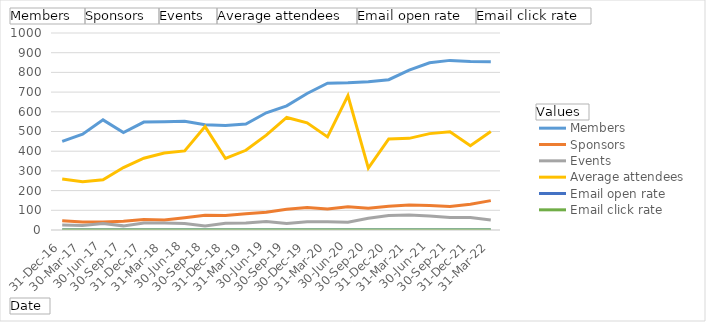
| Category | Members  | Sponsors  | Events  | Average attendees  | Email open rate  | Email click rate  |
|---|---|---|---|---|---|---|
| 31-Dec-16 | 450 | 47 | 25 | 258.817 | 0.225 | 0.022 |
| 30-Mar-17 | 486 | 40 | 23 | 244.667 | 0.233 | 0.023 |
| 30-Jun-17 | 559 | 40 | 33 | 254.867 | 0.201 | 0.014 |
| 30-Sep-17 | 495 | 44 | 21 | 317 | 0.222 | 0.02 |
| 31-Dec-17 | 548 | 53 | 36 | 364.333 | 0.22 | 0.023 |
| 31-Mar-18 | 550 | 51 | 36 | 390.667 | 0.225 | 0.027 |
| 30-Jun-18 | 552 | 62 | 33 | 401.333 | 0.216 | 0.018 |
| 30-Sep-18 | 534 | 75 | 20 | 525 | 0.208 | 0.026 |
| 31-Dec-18 | 530 | 73 | 34 | 363.233 | 0.217 | 0.024 |
| 31-Mar-19 | 538 | 82 | 35 | 404.667 | 0.214 | 0.023 |
| 30-Jun-19 | 595 | 90 | 43 | 481.81 | 0.229 | 0.034 |
| 30-Sep-19 | 630 | 105 | 33 | 571.4 | 0.22 | 0.03 |
| 30-Dec-19 | 693 | 114 | 42 | 544.083 | 0.23 | 0.029 |
| 31-Mar-20 | 745 | 107 | 42 | 472.667 | 0.146 | 0.015 |
| 30-Jun-20 | 747 | 118 | 39 | 682.117 | 0.234 | 0.04 |
| 30-Sep-20 | 753 | 110 | 60 | 313.967 | 0.202 | 0.019 |
| 31-Dec-20 | 763 | 120 | 74 | 462.149 | 0.195 | 0.017 |
| 31-Mar-21 | 812 | 127 | 76 | 465.236 | 0.221 | 0.011 |
| 30-Jun-21 | 849 | 124 | 71 | 489.294 | 0.225 | 0.01 |
| 30-Sep-21 | 861 | 119 | 63 | 498.961 | 0.215 | 0.012 |
| 31-Dec-21 | 855 | 131 | 64 | 427.655 | 0.182 | 0.01 |
| 31-Mar-22 | 854 | 149 | 51 | 499.764 | 0.282 | 0.018 |